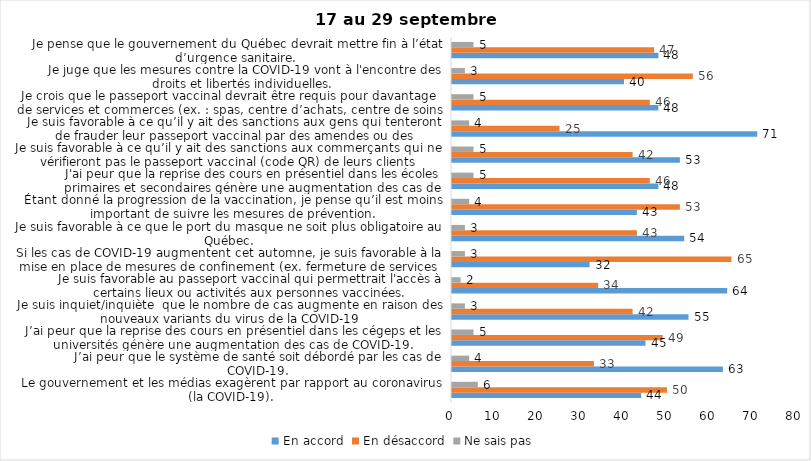
| Category | En accord | En désaccord | Ne sais pas |
|---|---|---|---|
| Le gouvernement et les médias exagèrent par rapport au coronavirus (la COVID-19). | 44 | 50 | 6 |
| J’ai peur que le système de santé soit débordé par les cas de COVID-19. | 63 | 33 | 4 |
| J’ai peur que la reprise des cours en présentiel dans les cégeps et les universités génère une augmentation des cas de COVID-19. | 45 | 49 | 5 |
| Je suis inquiet/inquiète  que le nombre de cas augmente en raison des nouveaux variants du virus de la COVID-19 | 55 | 42 | 3 |
| Je suis favorable au passeport vaccinal qui permettrait l'accès à certains lieux ou activités aux personnes vaccinées. | 64 | 34 | 2 |
| Si les cas de COVID-19 augmentent cet automne, je suis favorable à la mise en place de mesures de confinement (ex. fermeture de services non essentiels, interdiction des rassemblements privés) | 32 | 65 | 3 |
| Je suis favorable à ce que le port du masque ne soit plus obligatoire au Québec. | 54 | 43 | 3 |
| Étant donné la progression de la vaccination, je pense qu’il est moins important de suivre les mesures de prévention. | 43 | 53 | 4 |
| J'ai peur que la reprise des cours en présentiel dans les écoles primaires et secondaires génère une augmentation des cas de COVID-19 | 48 | 46 | 5 |
| Je suis favorable à ce qu’il y ait des sanctions aux commerçants qui ne vérifieront pas le passeport vaccinal (code QR) de leurs clients | 53 | 42 | 5 |
| Je suis favorable à ce qu’il y ait des sanctions aux gens qui tenteront de frauder leur passeport vaccinal par des amendes ou des accusations criminelles. | 71 | 25 | 4 |
| Je crois que le passeport vaccinal devrait être requis pour davantage de services et commerces (ex. : spas, centre d’achats, centre de soins personnels. | 48 | 46 | 5 |
| Je juge que les mesures contre la COVID-19 vont à l'encontre des droits et libertés individuelles.  | 40 | 56 | 3 |
| Je pense que le gouvernement du Québec devrait mettre fin à l’état d’urgence sanitaire.  | 48 | 47 | 5 |